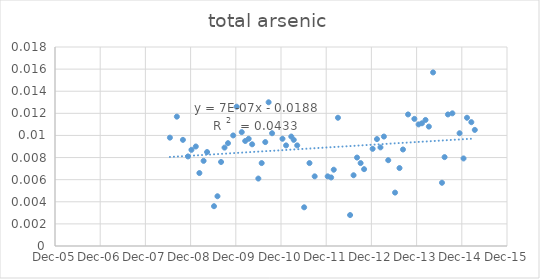
| Category | Series 0 |
|---|---|
| 39618.0 | 0.01 |
| 39674.0 | 0.012 |
| 39723.0 | 0.01 |
| 39764.0 | 0.008 |
| 39792.0 | 0.009 |
| 39827.0 | 0.009 |
| 39856.0 | 0.007 |
| 39890.0 | 0.008 |
| 39918.0 | 0.008 |
| 39974.0 | 0.004 |
| 40002.0 | 0.004 |
| 40031.0 | 0.008 |
| 40059.0 | 0.009 |
| 40087.0 | 0.009 |
| 40129.0 | 0.01 |
| 40157.0 | 0.013 |
| 40198.0 | 0.01 |
| 40226.0 | 0.01 |
| 40282.0 | 0.009 |
| 40254.0 | 0.01 |
| 40332.0 | 0.006 |
| 40359.0 | 0.008 |
| 40388.0 | 0.009 |
| 40415.0 | 0.013 |
| 40443.0 | 0.01 |
| 40527.0 | 0.01 |
| 40556.0 | 0.009 |
| 40598.0 | 0.01 |
| 40618.0 | 0.01 |
| 40646.0 | 0.009 |
| 40702.0 | 0.004 |
| 40745.0 | 0.008 |
| 40787.0 | 0.006 |
| 40892.0 | 0.006 |
| 40920.0 | 0.006 |
| 40941.0 | 0.007 |
| 40975.0 | 0.012 |
| 41073.0 | 0.003 |
| 41101.0 | 0.006 |
| 41129.0 | 0.008 |
| 41158.0 | 0.008 |
| 41186.0 | 0.007 |
| 41255.0 | 0.009 |
| 41290.0 | 0.01 |
| 41318.0 | 0.009 |
| 41346.0 | 0.01 |
| 41381.0 | 0.008 |
| 41436.0 | 0.005 |
| 41472.0 | 0.007 |
| 41500.0 | 0.009 |
| 41541.0 | 0.012 |
| 41592.0 | 0.012 |
| 41626.0 | 0.011 |
| 41653.0 | 0.011 |
| 41682.0 | 0.011 |
| 41709.0 | 0.011 |
| 41743.0 | 0.016 |
| 41815.0 | 0.006 |
| 41836.0 | 0.008 |
| 41863.0 | 0.012 |
| 41899.0 | 0.012 |
| 41957.0 | 0.01 |
| 41989.0 | 0.008 |
| 42017.0 | 0.012 |
| 42052.0 | 0.011 |
| 42080.0 | 0.01 |